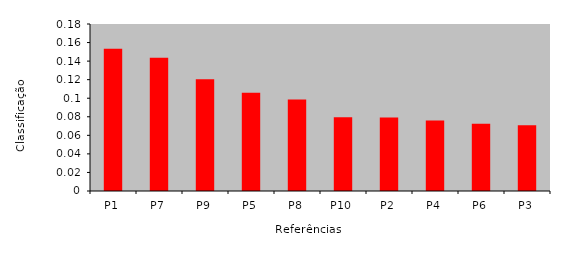
| Category | Series 0 |
|---|---|
| P1 | 0.153 |
| P7 | 0.144 |
| P9 | 0.12 |
| P5 | 0.106 |
| P8 | 0.099 |
| P10 | 0.08 |
| P2 | 0.079 |
| P4 | 0.076 |
| P6 | 0.073 |
| P3 | 0.071 |